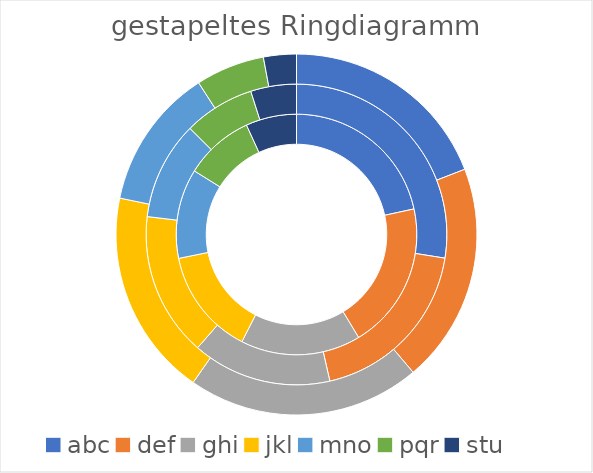
| Category | X | Y | Z |
|---|---|---|---|
| abc | 9.5 | 11.2 | 6.5 |
| def | 8.7 | 7.7 | 6.7 |
| ghi | 7.1 | 6.1 | 7.1 |
| jkl | 6.3 | 6.3 | 6.3 |
| mno | 5.3 | 4.3 | 4.3 |
| pqr | 4.1 | 3.1 | 2.1 |
| stu | 3 | 2 | 1 |